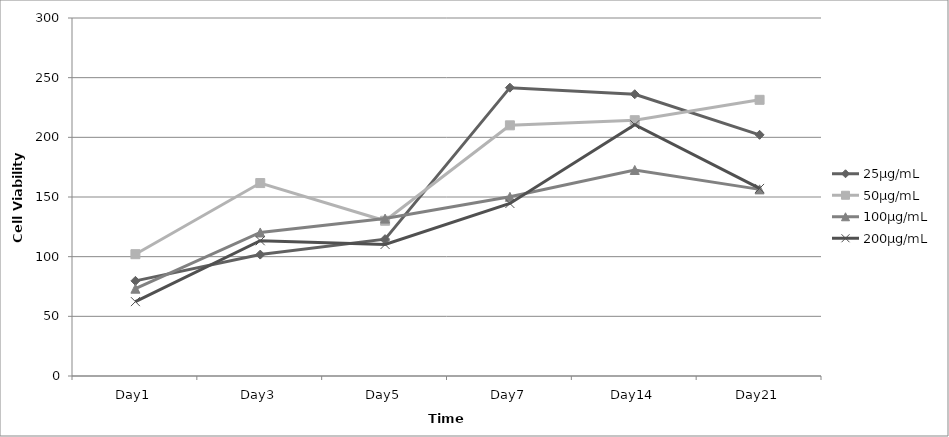
| Category | 25µg/mL | 50µg/mL | 100µg/mL | 200µg/mL |
|---|---|---|---|---|
| Day1 | 79.737 | 102.081 | 73.165 | 62.322 |
| Day3 | 101.738 | 161.672 | 120.281 | 113.328 |
| Day5 | 114.703 | 130.095 | 131.9 | 110.232 |
| Day7 | 241.617 | 210.059 | 150.148 | 144.576 |
| Day14 | 236.111 | 214.359 | 172.65 | 210.556 |
| Day21 | 202.095 | 231.431 | 156.383 | 157.189 |